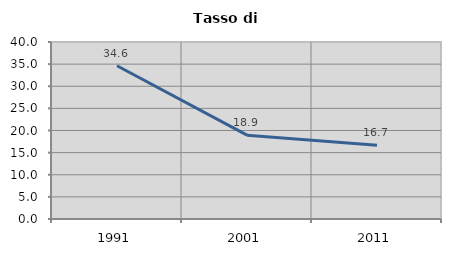
| Category | Tasso di disoccupazione   |
|---|---|
| 1991.0 | 34.633 |
| 2001.0 | 18.95 |
| 2011.0 | 16.674 |